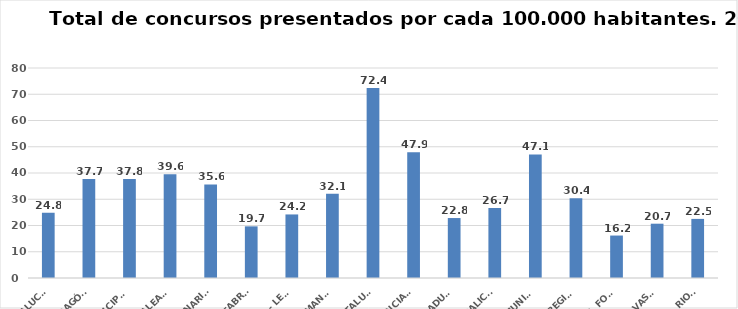
| Category | Series 0 |
|---|---|
| ANDALUCÍA | 24.82 |
| ARAGÓN | 37.7 |
| ASTURIAS, PRINCIPADO | 37.755 |
| ILLES BALEARS | 39.556 |
| CANARIAS | 35.62 |
| CANTABRIA | 19.675 |
| CASTILLA - LEÓN | 24.212 |
| CASTILLA - LA MANCHA | 32.104 |
| CATALUÑA | 72.366 |
| C. VALENCIANA | 47.863 |
| EXTREMADURA | 22.841 |
| GALICIA | 26.673 |
| MADRID, COMUNIDAD | 47.088 |
| MURCIA, REGIÓN | 30.359 |
| NAVARRA, COM. FORAL | 16.174 |
| PAÍS VASCO | 20.687 |
| LA RIOJA | 22.514 |